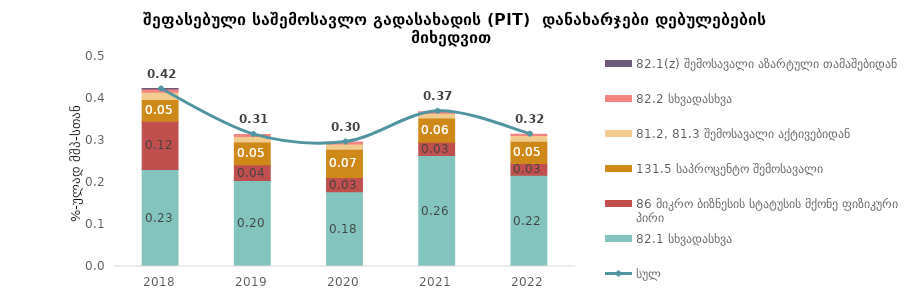
| Category | 82.1 სხვადასხვა | 86 მიკრო ბიზნესის სტატუსის მქონე ფიზიკური პირი | 131.5 საპროცენტო შემოსავალი | 81.2, 81.3 შემოსავალი აქტივებიდან | 82.2 სხვადასხვა | 82.1(z) შემოსავალი აზარტული თამაშებიდან |
|---|---|---|---|---|---|---|
| 2018.0 | 0.231 | 0.115 | 0.052 | 0.017 | 0.008 | 0.001 |
| 2019.0 | 0.205 | 0.037 | 0.054 | 0.013 | 0.005 | 0 |
| 2020.0 | 0.178 | 0.034 | 0.067 | 0.012 | 0.005 | 0 |
| 2021.0 | 0.264 | 0.032 | 0.058 | 0.011 | 0.004 | 0 |
| 2022.0 | 0.217 | 0.028 | 0.053 | 0.014 | 0.003 | 0 |